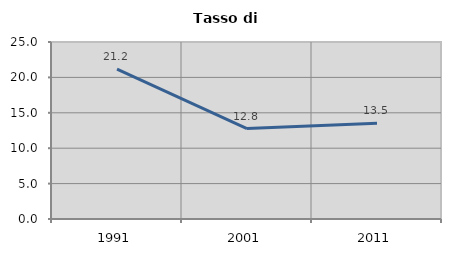
| Category | Tasso di disoccupazione   |
|---|---|
| 1991.0 | 21.154 |
| 2001.0 | 12.775 |
| 2011.0 | 13.528 |